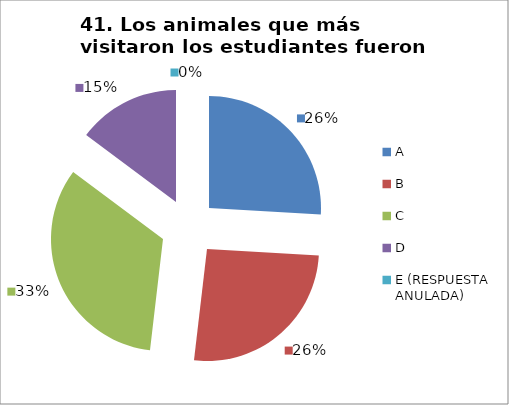
| Category | CANTIDAD DE RESPUESTAS PREGUNTA (41) | PORCENTAJE |
|---|---|---|
| A | 7 | 0.259 |
| B | 7 | 0.259 |
| C | 9 | 0.333 |
| D | 4 | 0.148 |
| E (RESPUESTA ANULADA) | 0 | 0 |